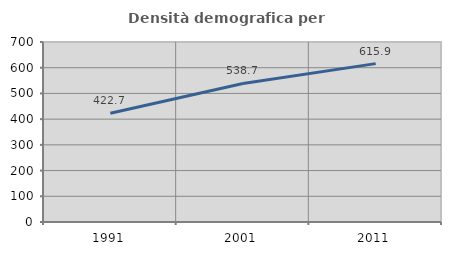
| Category | Densità demografica |
|---|---|
| 1991.0 | 422.676 |
| 2001.0 | 538.741 |
| 2011.0 | 615.854 |